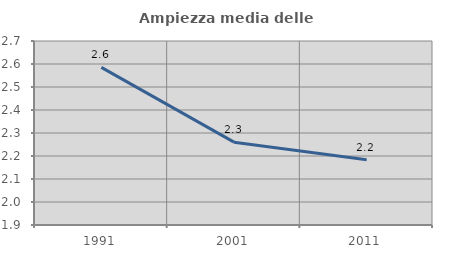
| Category | Ampiezza media delle famiglie |
|---|---|
| 1991.0 | 2.585 |
| 2001.0 | 2.26 |
| 2011.0 | 2.184 |